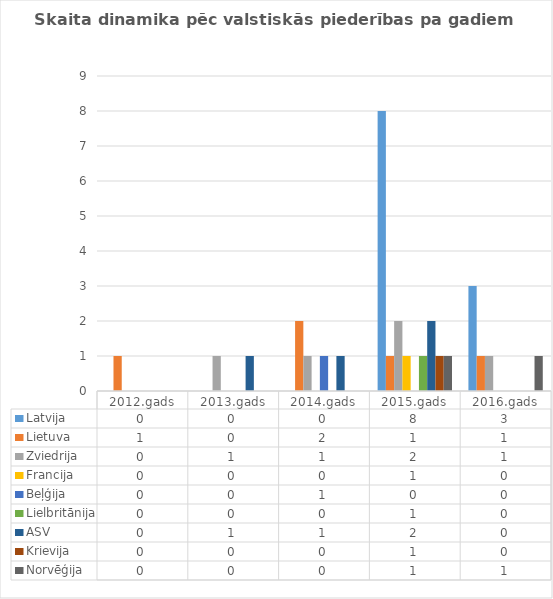
| Category | Latvija | Lietuva | Zviedrija | Francija | Beļģija | Lielbritānija | ASV | Krievija | Norvēģija |
|---|---|---|---|---|---|---|---|---|---|
| 2012.gads | 0 | 1 | 0 | 0 | 0 | 0 | 0 | 0 | 0 |
| 2013.gads | 0 | 0 | 1 | 0 | 0 | 0 | 1 | 0 | 0 |
| 2014.gads | 0 | 2 | 1 | 0 | 1 | 0 | 1 | 0 | 0 |
| 2015.gads | 8 | 1 | 2 | 1 | 0 | 1 | 2 | 1 | 1 |
| 2016.gads | 3 | 1 | 1 | 0 | 0 | 0 | 0 | 0 | 1 |